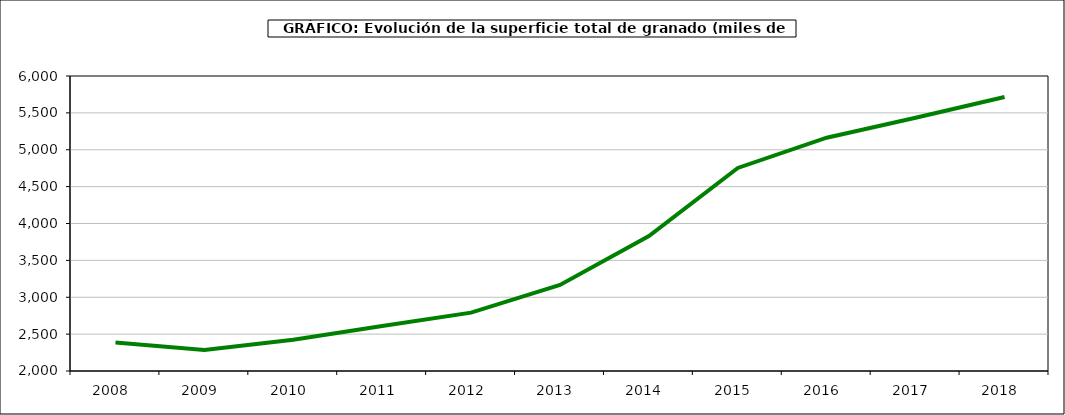
| Category | superficie granado |
|---|---|
| 2008.0 | 2387 |
| 2009.0 | 2285 |
| 2010.0 | 2425 |
| 2011.0 | 2610 |
| 2012.0 | 2791 |
| 2013.0 | 3167 |
| 2014.0 | 3830 |
| 2015.0 | 4753 |
| 2016.0 | 5163 |
| 2017.0 | 5434 |
| 2018.0 | 5716 |